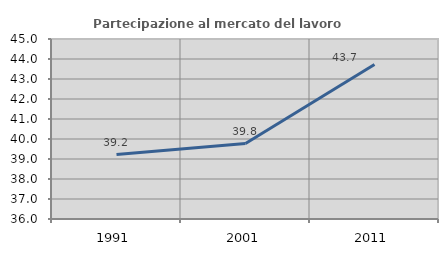
| Category | Partecipazione al mercato del lavoro  femminile |
|---|---|
| 1991.0 | 39.221 |
| 2001.0 | 39.774 |
| 2011.0 | 43.722 |